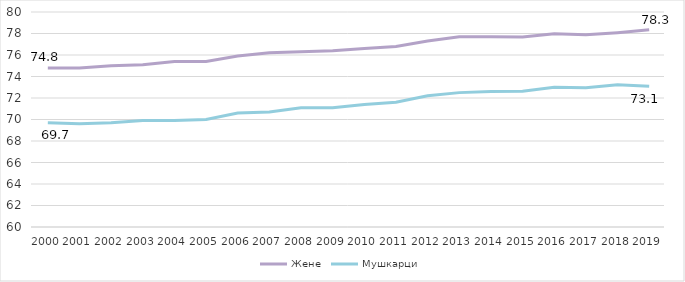
| Category | Жене | Мушкарци |
|---|---|---|
| 2000.0 | 74.8 | 69.7 |
| 2001.0 | 74.8 | 69.6 |
| 2002.0 | 75 | 69.7 |
| 2003.0 | 75.1 | 69.9 |
| 2004.0 | 75.4 | 69.9 |
| 2005.0 | 75.4 | 70 |
| 2006.0 | 75.9 | 70.6 |
| 2007.0 | 76.2 | 70.7 |
| 2008.0 | 76.3 | 71.1 |
| 2009.0 | 76.4 | 71.1 |
| 2010.0 | 76.6 | 71.4 |
| 2011.0 | 76.8 | 71.6 |
| 2012.0 | 77.3 | 72.2 |
| 2013.0 | 77.7 | 72.5 |
| 2014.0 | 77.697 | 72.612 |
| 2015.0 | 77.674 | 72.625 |
| 2016.0 | 77.978 | 73.005 |
| 2017.0 | 77.876 | 72.95 |
| 2018.0 | 78.079 | 73.222 |
| 2019.0 | 78.347 | 73.087 |